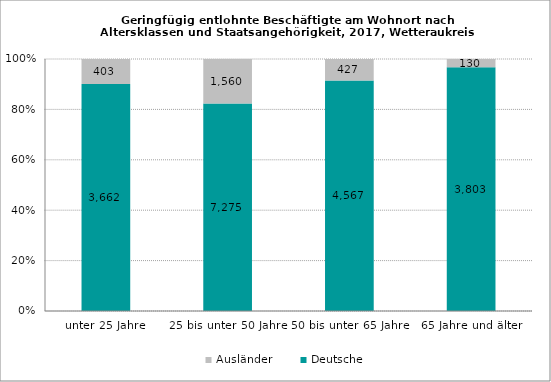
| Category | Deutsche | Ausländer |
|---|---|---|
| unter 25 Jahre | 3662 | 403 |
| 25 bis unter 50 Jahre | 7275 | 1560 |
| 50 bis unter 65 Jahre | 4567 | 427 |
| 65 Jahre und älter | 3803 | 130 |